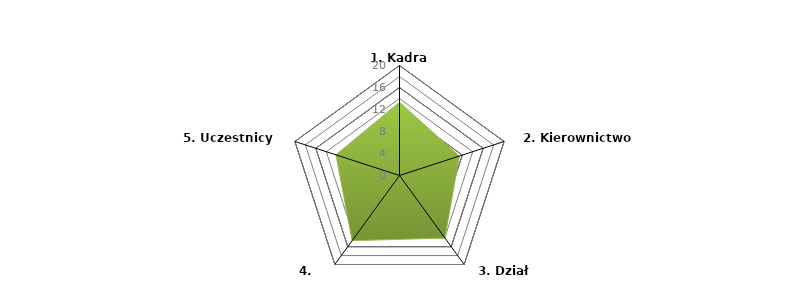
| Category | Series 0 | BENCHMARK |
|---|---|---|
| 1. Kadra naczelna |  | 13.312 |
| 2. Kierownictwo liniowe |  | 11.438 |
| 3. Dział szkoleń |  | 14.062 |
| 4. Trenerzy |  | 14.656 |
| 5. Uczestnicy szkoleń |  | 12.156 |